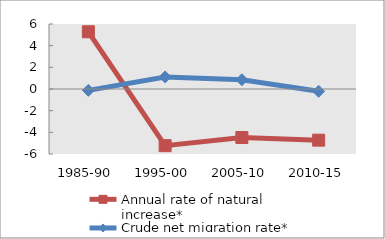
| Category | Annual rate of natural increase* | Crude net migration rate* |
|---|---|---|
| 1985-90 | 5.282 | -0.125 |
| 1995-00 | -5.231 | 1.113 |
| 2005-10 | -4.479 | 0.853 |
| 2010-15 | -4.723 | -0.213 |